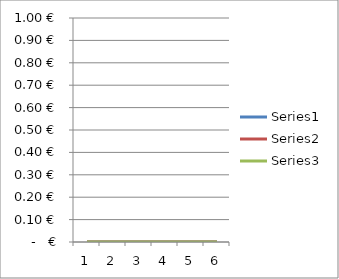
| Category | Series 0 | Series 1 | Series 2 |
|---|---|---|---|
| 0 | 0 | 0 | 0 |
| 1 | 0 | 0 | 0 |
| 2 | 0 | 0 | 0 |
| 3 | 0 | 0 | 0 |
| 4 | 0 | 0 | 0 |
| 5 | 0 | 0 | 0 |